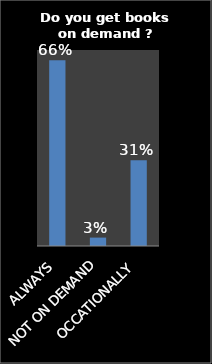
| Category | Series 0 |
|---|---|
| ALWAYS | 0.663 |
| NOT ON DEMAND | 0.03 |
| OCCATIONALLY | 0.307 |